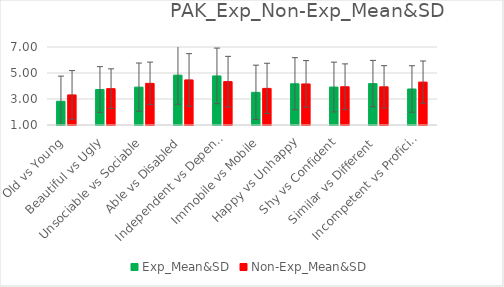
| Category | Exp_Mean&SD | Non-Exp_Mean&SD |
|---|---|---|
| Old vs Young | 2.825 | 3.314 |
|  Beautiful vs Ugly | 3.731 | 3.795 |
| Unsociable vs Sociable | 3.912 | 4.205 |
| Able vs Disabled | 4.834 | 4.469 |
| Independent vs Dependent | 4.776 | 4.339 |
| Immobile vs Mobile | 3.513 | 3.816 |
| Happy vs Unhappy | 4.172 | 4.159 |
| Shy vs Confident | 3.919 | 3.941 |
| Similar vs Different | 4.185 | 3.937 |
| Incompetent vs Proficient | 3.769 | 4.301 |